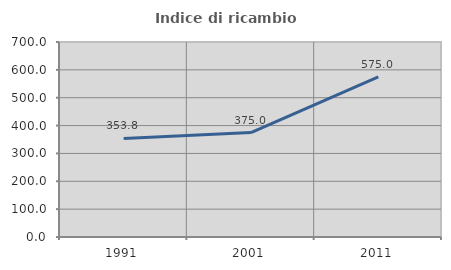
| Category | Indice di ricambio occupazionale  |
|---|---|
| 1991.0 | 353.846 |
| 2001.0 | 375 |
| 2011.0 | 575 |